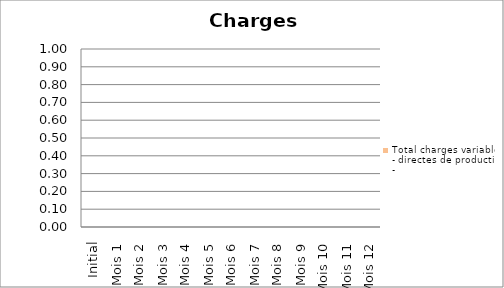
| Category | Total charges variables - directes de production |
|---|---|
| Initial | 0 |
| Mois 1 | 0 |
| Mois 2 | 0 |
| Mois 3 | 0 |
| Mois 4 | 0 |
| Mois 5 | 0 |
| Mois 6 | 0 |
| Mois 7 | 0 |
| Mois 8 | 0 |
| Mois 9 | 0 |
| Mois 10 | 0 |
| Mois 11 | 0 |
| Mois 12 | 0 |